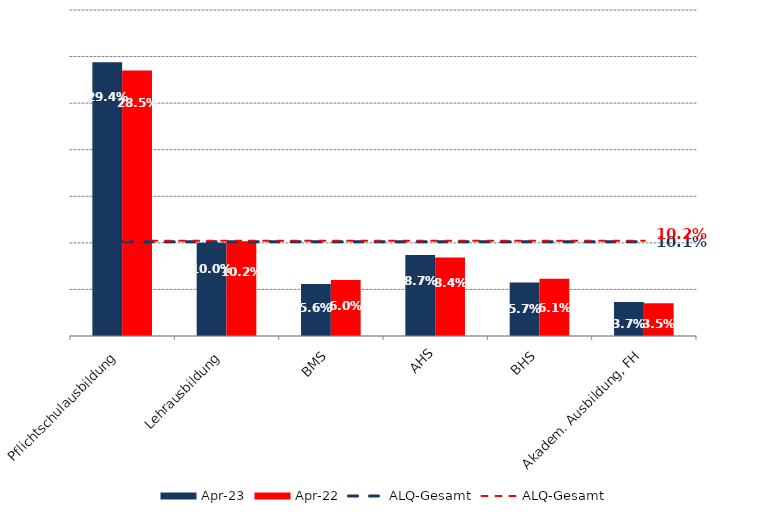
| Category | Apr 23 | Apr 22 |
|---|---|---|
| Pflichtschulausbildung | 0.294 | 0.285 |
| Lehrausbildung | 0.1 | 0.102 |
| BMS | 0.056 | 0.06 |
| AHS | 0.087 | 0.084 |
| BHS | 0.057 | 0.061 |
| Akadem. Ausbildung, FH | 0.037 | 0.035 |